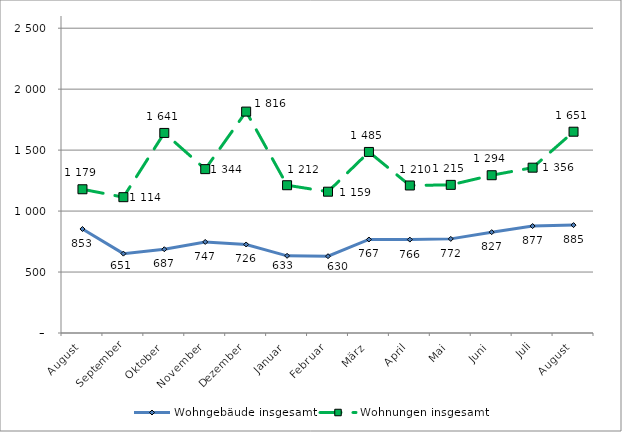
| Category | Wohngebäude insgesamt | Wohnungen insgesamt |
|---|---|---|
| August | 853 | 1179 |
| September | 651 | 1114 |
| Oktober | 687 | 1641 |
| November | 747 | 1344 |
| Dezember | 726 | 1816 |
| Januar | 633 | 1212 |
| Februar | 630 | 1159 |
| März | 767 | 1485 |
| April | 766 | 1210 |
| Mai | 772 | 1215 |
| Juni | 827 | 1294 |
| Juli | 877 | 1356 |
| August | 885 | 1651 |